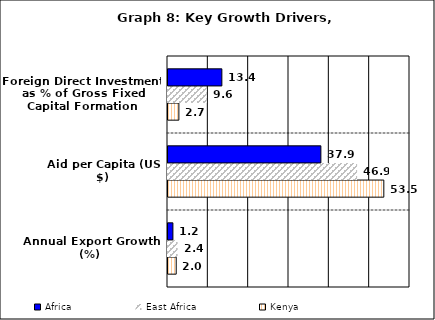
| Category | Kenya | East Africa | Africa |
|---|---|---|---|
| Annual Export Growth (%) | 2.037 | 2.399 | 1.219 |
| Aid per Capita (US $) | 53.511 | 46.888 | 37.904 |
| Foreign Direct Investment as % of Gross Fixed Capital Formation | 2.697 | 9.576 | 13.354 |